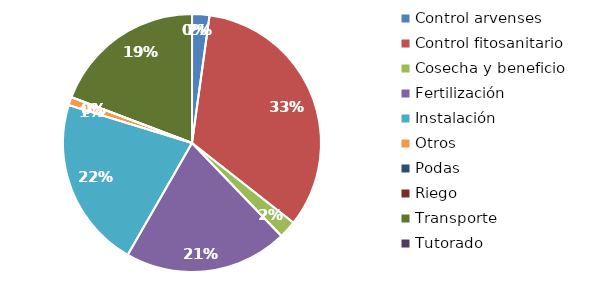
| Category | Valor |
|---|---|
| Control arvenses | 1215200 |
| Control fitosanitario | 18624500 |
| Cosecha y beneficio | 1236000 |
| Fertilización | 11416620 |
| Instalación | 11954210 |
| Otros | 576800 |
| Podas | 0 |
| Riego | 0 |
| Transporte | 10712000 |
| Tutorado | 0 |